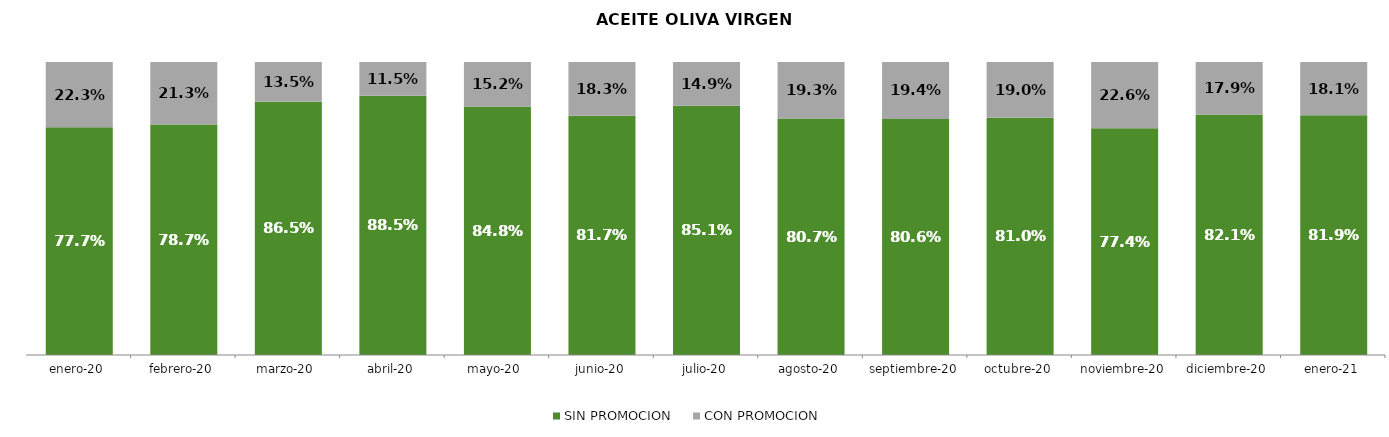
| Category | SIN PROMOCION   | CON PROMOCION   |
|---|---|---|
| 2020-01-01 | 0.777 | 0.223 |
| 2020-02-01 | 0.787 | 0.213 |
| 2020-03-01 | 0.865 | 0.135 |
| 2020-04-01 | 0.885 | 0.115 |
| 2020-05-01 | 0.848 | 0.152 |
| 2020-06-01 | 0.817 | 0.183 |
| 2020-07-01 | 0.851 | 0.149 |
| 2020-08-01 | 0.807 | 0.193 |
| 2020-09-01 | 0.806 | 0.194 |
| 2020-10-01 | 0.81 | 0.19 |
| 2020-11-01 | 0.774 | 0.226 |
| 2020-12-01 | 0.821 | 0.179 |
| 2021-01-01 | 0.819 | 0.181 |